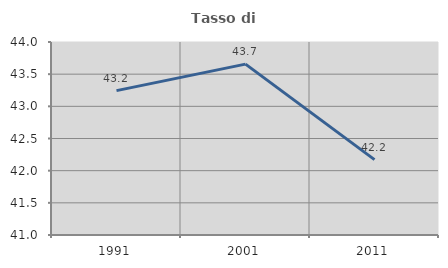
| Category | Tasso di occupazione   |
|---|---|
| 1991.0 | 43.244 |
| 2001.0 | 43.656 |
| 2011.0 | 42.172 |